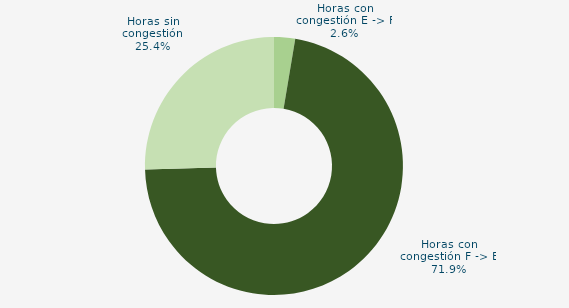
| Category | Horas con congestión E -> F |
|---|---|
| Horas con congestión E -> F | 2.639 |
| Horas con congestión F -> E | 71.944 |
| Horas sin congestión | 25.417 |